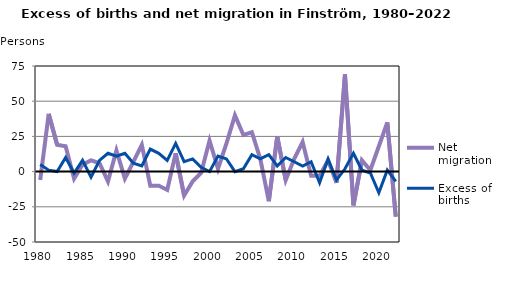
| Category | Net migration | Excess of births |
|---|---|---|
| 1980.0 | -6 | 5 |
| 1981.0 | 41 | 1 |
| 1982.0 | 19 | 0 |
| 1983.0 | 18 | 10 |
| 1984.0 | -5 | -1 |
| 1985.0 | 5 | 8 |
| 1986.0 | 8 | -4 |
| 1987.0 | 6 | 8 |
| 1988.0 | -7 | 13 |
| 1989.0 | 15 | 11 |
| 1990.0 | -5 | 13 |
| 1991.0 | 7 | 6 |
| 1992.0 | 19 | 4 |
| 1993.0 | -10 | 16 |
| 1994.0 | -10 | 13 |
| 1995.0 | -13 | 8 |
| 1996.0 | 13 | 20 |
| 1997.0 | -17 | 7 |
| 1998.0 | -7 | 9 |
| 1999.0 | -1 | 3 |
| 2000.0 | 22 | 0 |
| 2001.0 | 2 | 11 |
| 2002.0 | 20 | 9 |
| 2003.0 | 40 | 0 |
| 2004.0 | 26 | 2 |
| 2005.0 | 28 | 12 |
| 2006.0 | 9 | 9 |
| 2007.0 | -21 | 12 |
| 2008.0 | 25 | 4 |
| 2009.0 | -6 | 10 |
| 2010.0 | 9 | 7 |
| 2011.0 | 21 | 4 |
| 2012.0 | -3 | 7 |
| 2013.0 | -3 | -8 |
| 2014.0 | 8 | 9 |
| 2015.0 | -8 | -6 |
| 2016.0 | 69 | 2 |
| 2017.0 | -24 | 13 |
| 2018.0 | 8 | 1 |
| 2019.0 | 1 | -1 |
| 2020.0 | 18 | -15 |
| 2021.0 | 35 | 1 |
| 2022.0 | -32 | -7 |